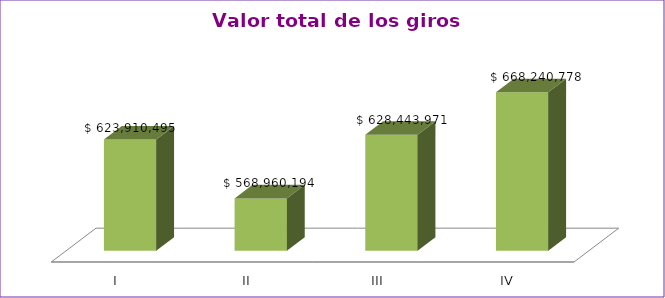
| Category | Series 0 |
|---|---|
| I | 623910495 |
| II | 568960194 |
| III | 628443971 |
| IV | 668240778 |